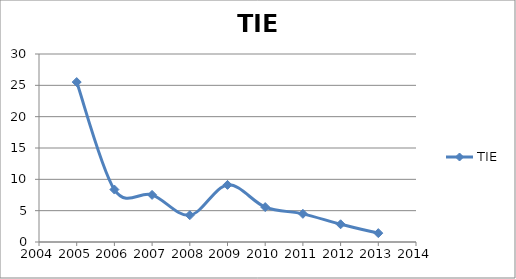
| Category | TIE |
|---|---|
| 2005.0 | 25.523 |
| 2006.0 | 8.368 |
| 2007.0 | 7.516 |
| 2008.0 | 4.278 |
| 2009.0 | 9.113 |
| 2010.0 | 5.572 |
| 2011.0 | 4.493 |
| 2012.0 | 2.828 |
| 2013.0 | 1.416 |